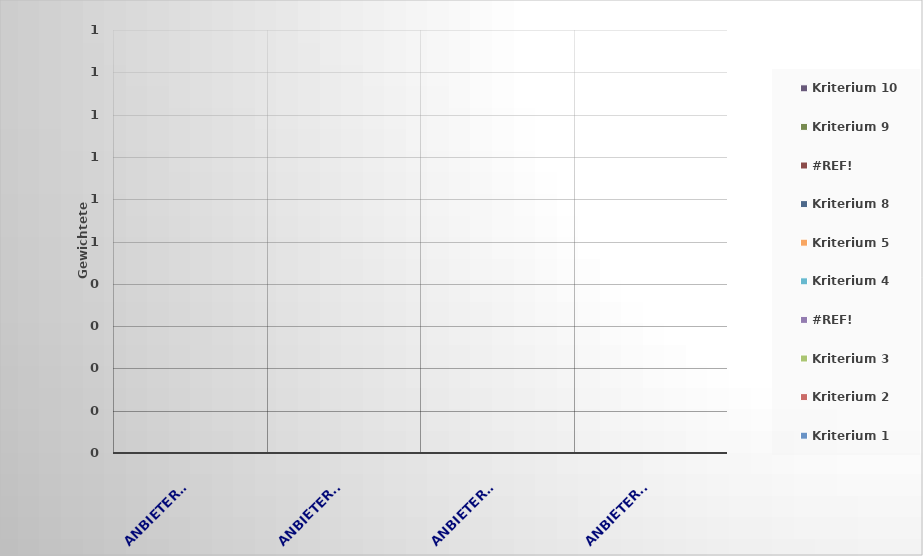
| Category | Kriterium 1 | Kriterium 2 | Kriterium 3 | #REF! | Kriterium 4 | Kriterium 5 | Kriterium 8 | Kriterium 9 | Kriterium 10 |
|---|---|---|---|---|---|---|---|---|---|
| Anbieter A | 0 | 0 | 0 | 0 | 0 | 0 | 0 | 0 | 0 |
| Anbieter B | 0 | 0 | 0 | 0 | 0 | 0 | 0 | 0 | 0 |
| Anbieter C | 0 | 0 | 0 | 0 | 0 | 0 | 0 | 0 | 0 |
| Anbieter D | 0 | 0 | 0 | 0 | 0 | 0 | 0 | 0 | 0 |